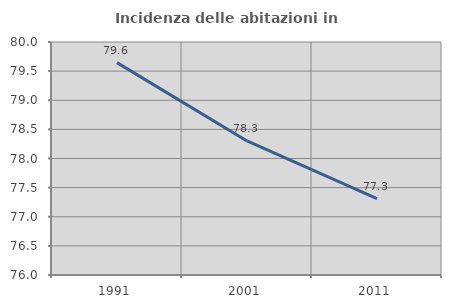
| Category | Incidenza delle abitazioni in proprietà  |
|---|---|
| 1991.0 | 79.646 |
| 2001.0 | 78.302 |
| 2011.0 | 77.311 |